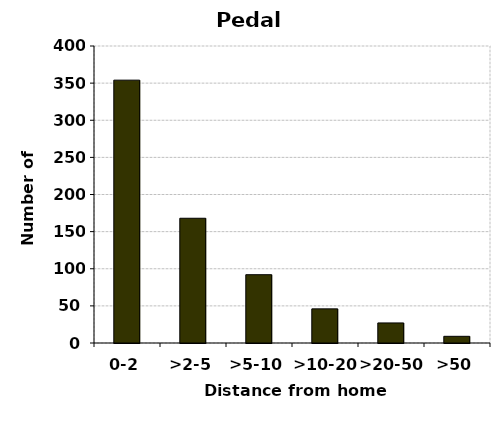
| Category | Pedal cycles |
|---|---|
| 0-2 | 354 |
| >2-5 | 168 |
| >5-10 | 92 |
| >10-20 | 46 |
| >20-50 | 27 |
| >50 | 9 |